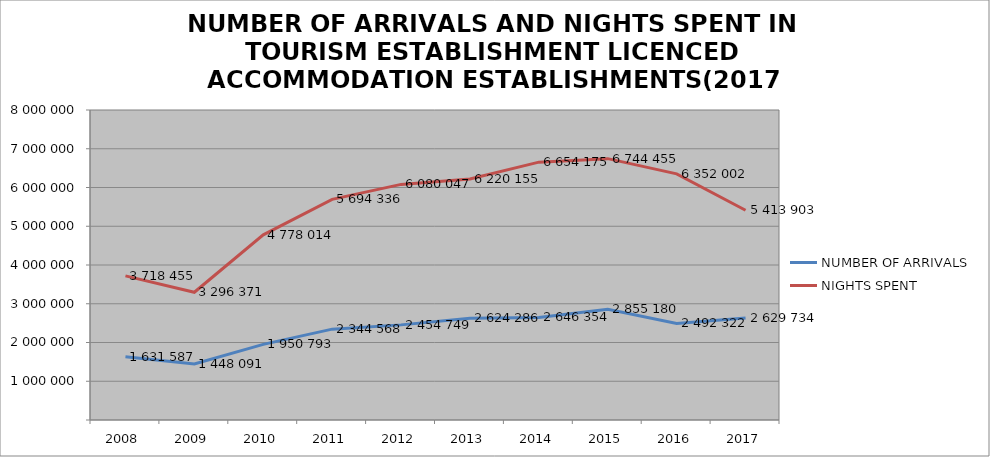
| Category | NUMBER OF ARRIVALS | NIGHTS SPENT |
|---|---|---|
| 2008 | 1631587 | 3718455 |
| 2009 | 1448091 | 3296371 |
| 2010 | 1950793 | 4778014 |
| 2011 | 2344568 | 5694336 |
| 2012 | 2454749 | 6080047 |
| 2013 | 2624286 | 6220155 |
| 2014 | 2646354 | 6654175 |
| 2015 | 2855180 | 6744455 |
| 2016 | 2492322 | 6352002 |
| 2017 | 2629734 | 5413903 |